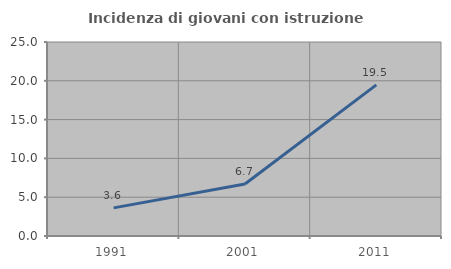
| Category | Incidenza di giovani con istruzione universitaria |
|---|---|
| 1991.0 | 3.623 |
| 2001.0 | 6.701 |
| 2011.0 | 19.469 |